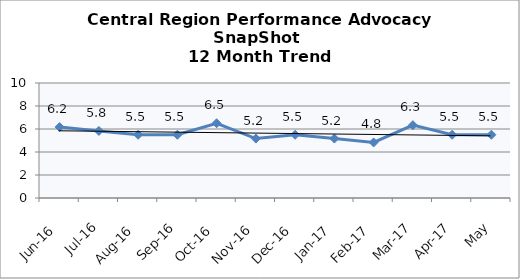
| Category | Central Region |
|---|---|
| Jun-16 | 6.167 |
| Jul-16 | 5.833 |
| Aug-16 | 5.5 |
| Sep-16 | 5.5 |
| Oct-16 | 6.5 |
| Nov-16 | 5.167 |
| Dec-16 | 5.5 |
| Jan-17 | 5.167 |
| Feb-17 | 4.833 |
| Mar-17 | 6.333 |
| Apr-17 | 5.5 |
| May | 5.5 |